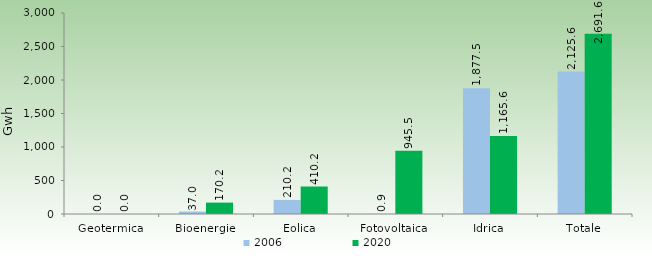
| Category | 2006 | 2020 |
|---|---|---|
| Geotermica | 0 | 0 |
| Bioenergie | 37 | 170.2 |
| Eolica | 210.2 | 410.2 |
| Fotovoltaica | 0.9 | 945.5 |
| Idrica | 1877.5 | 1165.6 |
| Totale | 2125.6 | 2691.6 |